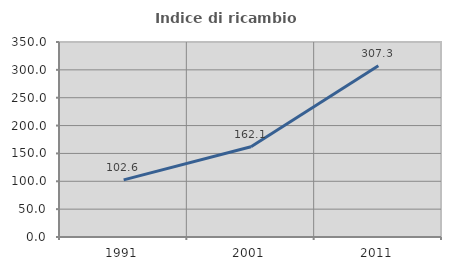
| Category | Indice di ricambio occupazionale  |
|---|---|
| 1991.0 | 102.564 |
| 2001.0 | 162.069 |
| 2011.0 | 307.273 |